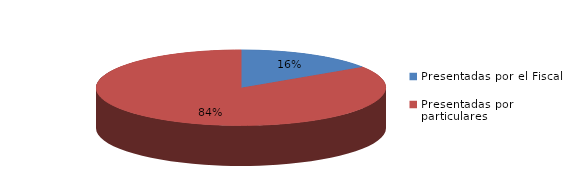
| Category | Series 0 |
|---|---|
| Presentadas por el Fiscal | 65 |
| Presentadas por particulares | 348 |